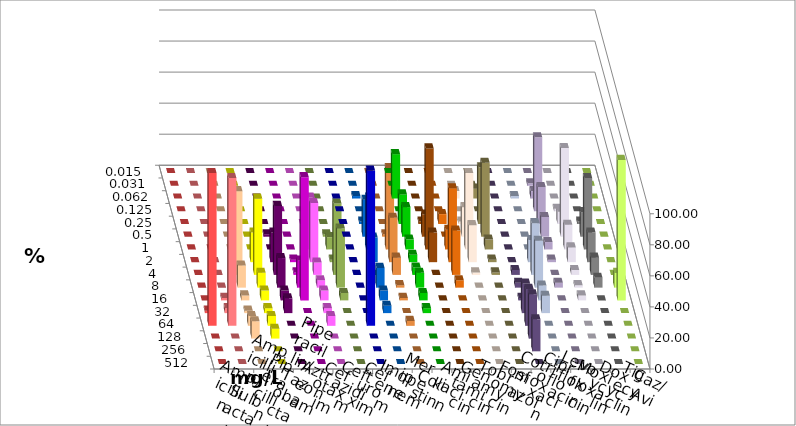
| Category | Ampicillin | Ampicillin/ Sulbactam | Piperacillin | Piperacillin/ Tazobactam | Aztreonam | Cefotaxim | Ceftazidim | Cefuroxim | Imipenem | Meropenem | Colistin | Amikacin | Gentamicin | Tobramycin | Fosfomycin | Cotrimoxazol | Ciprofloxacin | Levofloxacin | Moxifloxacin | Doxycyclin | Tigecyclin | Caz/Avi |
|---|---|---|---|---|---|---|---|---|---|---|---|---|---|---|---|---|---|---|---|---|---|---|
| 0.015 | 0 | 0 | 0 | 0 | 0 | 0 | 0 | 0 | 0 | 0 | 0 | 0 | 0 | 0 | 0 | 0 | 0 | 0 | 0 | 0 | 0 | 0 |
| 0.031 | 0 | 0 | 0 | 0 | 0 | 0 | 0 | 0 | 0 | 0 | 0 | 0 | 0 | 0 | 0 | 0 | 1.587 | 0 | 0 | 0 | 0 | 0 |
| 0.062 | 0 | 0 | 0 | 0 | 0 | 0 | 0 | 0 | 1.587 | 28.571 | 0 | 0 | 4.762 | 6.349 | 0 | 1.587 | 4.762 | 0 | 0 | 0 | 0 | 0 |
| 0.125 | 0 | 0 | 0 | 0 | 0 | 0 | 0 | 0 | 0 | 0 | 0 | 0 | 0 | 0 | 0 | 0 | 47.619 | 1.587 | 0 | 0 | 0 | 0 |
| 0.25 | 0 | 0 | 0 | 0 | 0 | 0 | 0 | 0 | 1.587 | 19.048 | 1.587 | 6.349 | 1.587 | 36.508 | 0 | 0 | 23.81 | 7.937 | 1.587 | 0 | 0 | 0 |
| 0.5 | 0 | 0 | 0 | 0 | 1.587 | 0 | 0 | 0 | 23.81 | 19.048 | 14.286 | 0 | 19.048 | 47.619 | 0 | 0 | 12.698 | 57.143 | 15.873 | 0 | 1.587 | 1.587 |
| 1.0 | 0 | 0 | 0 | 0 | 0 | 0 | 33.333 | 0 | 33.333 | 6.349 | 65.079 | 12.698 | 49.206 | 6.349 | 0 | 0 | 4.762 | 15.873 | 46.032 | 0 | 7.937 | 52.381 |
| 2.0 | 0 | 0 | 9.524 | 19.048 | 19.048 | 1.587 | 38.095 | 0 | 15.873 | 4.762 | 19.048 | 47.619 | 23.81 | 1.587 | 0 | 14.286 | 1.587 | 9.524 | 19.048 | 0 | 1.587 | 28.571 |
| 4.0 | 0 | 0 | 53.968 | 49.206 | 44.444 | 1.587 | 7.937 | 0 | 0 | 4.762 | 0 | 28.571 | 1.587 | 1.587 | 3.175 | 33.333 | 0 | 3.175 | 11.111 | 0 | 46.032 | 11.111 |
| 8.0 | 0 | 0 | 14.286 | 9.524 | 19.048 | 17.46 | 4.762 | 0 | 12.698 | 9.524 | 0 | 4.762 | 0 | 0 | 3.175 | 30.159 | 3.175 | 1.587 | 6.349 | 9.524 | 38.095 | 1.587 |
| 16.0 | 0 | 1.587 | 3.175 | 6.349 | 6.349 | 79.365 | 6.349 | 0 | 6.349 | 4.762 | 0 | 0 | 0 | 0 | 1.587 | 9.524 | 0 | 3.175 | 0 | 90.476 | 4.762 | 1.587 |
| 32.0 | 1.587 | 3.175 | 1.587 | 3.175 | 9.524 | 0 | 3.175 | 0 | 4.762 | 3.175 | 0 | 0 | 0 | 0 | 19.048 | 11.111 | 0 | 0 | 0 | 0 | 0 | 0 |
| 64.0 | 98.413 | 95.238 | 6.349 | 6.349 | 0 | 0 | 6.349 | 100 | 0 | 0 | 0 | 0 | 0 | 0 | 23.81 | 0 | 0 | 0 | 0 | 0 | 0 | 3.175 |
| 128.0 | 0 | 0 | 11.111 | 6.349 | 0 | 0 | 0 | 0 | 0 | 0 | 0 | 0 | 0 | 0 | 28.571 | 0 | 0 | 0 | 0 | 0 | 0 | 0 |
| 256.0 | 0 | 0 | 0 | 0 | 0 | 0 | 0 | 0 | 0 | 0 | 0 | 0 | 0 | 0 | 20.635 | 0 | 0 | 0 | 0 | 0 | 0 | 0 |
| 512.0 | 0 | 0 | 0 | 0 | 0 | 0 | 0 | 0 | 0 | 0 | 0 | 0 | 0 | 0 | 0 | 0 | 0 | 0 | 0 | 0 | 0 | 0 |